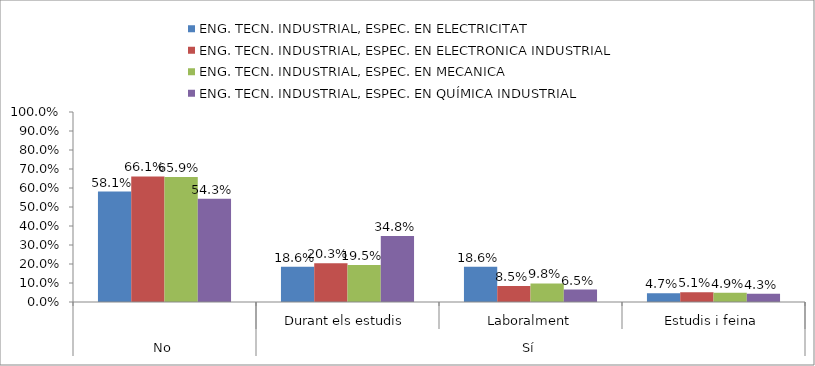
| Category | ENG. TECN. INDUSTRIAL, ESPEC. EN ELECTRICITAT | ENG. TECN. INDUSTRIAL, ESPEC. EN ELECTRONICA INDUSTRIAL | ENG. TECN. INDUSTRIAL, ESPEC. EN MECANICA | ENG. TECN. INDUSTRIAL, ESPEC. EN QUÍMICA INDUSTRIAL |
|---|---|---|---|---|
| 0 | 0.581 | 0.661 | 0.659 | 0.543 |
| 1 | 0.186 | 0.203 | 0.195 | 0.348 |
| 2 | 0.186 | 0.085 | 0.098 | 0.065 |
| 3 | 0.047 | 0.051 | 0.049 | 0.043 |